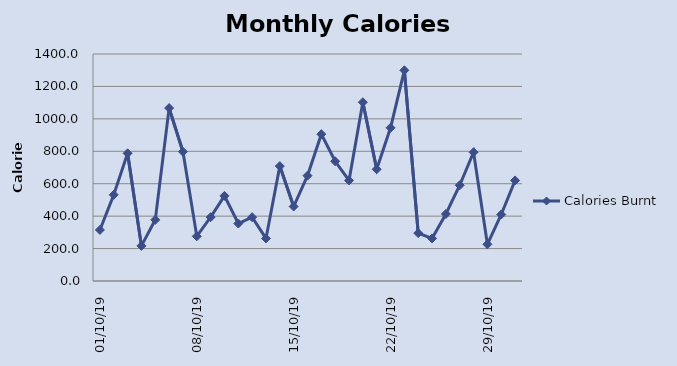
| Category | Calories Burnt |
|---|---|
| 2019-10-01 | 315 |
| 2019-10-02 | 531.563 |
| 2019-10-03 | 787.5 |
| 2019-10-04 | 216.562 |
| 2019-10-05 | 377.344 |
| 2019-10-06 | 1066.406 |
| 2019-10-07 | 797.344 |
| 2019-10-08 | 275.625 |
| 2019-10-09 | 393.75 |
| 2019-10-10 | 525 |
| 2019-10-11 | 354.375 |
| 2019-10-12 | 393.75 |
| 2019-10-13 | 262.5 |
| 2019-10-14 | 708.75 |
| 2019-10-15 | 459.375 |
| 2019-10-16 | 649.688 |
| 2019-10-17 | 905.625 |
| 2019-10-18 | 738.281 |
| 2019-10-19 | 620.156 |
| 2019-10-20 | 1102.5 |
| 2019-10-21 | 689.062 |
| 2019-10-22 | 945 |
| 2019-10-23 | 1299.375 |
| 2019-10-24 | 295.312 |
| 2019-10-25 | 262.5 |
| 2019-10-26 | 413.438 |
| 2019-10-27 | 590.625 |
| 2019-10-28 | 794.062 |
| 2019-10-29 | 226.406 |
| 2019-10-30 | 410.156 |
| 2019-10-31 | 620.156 |